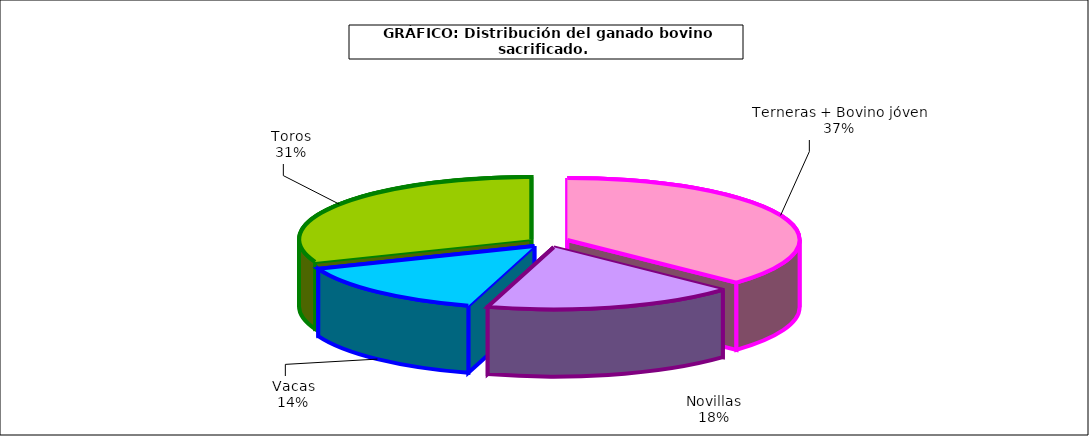
| Category | Series 0 |
|---|---|
| Terneras + Bovino jóven | 944986 |
| Novillas | 448318 |
| Vacas | 368561 |
| Toros | 790503 |